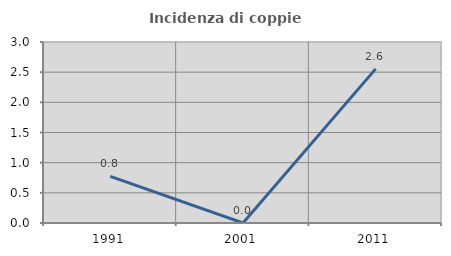
| Category | Incidenza di coppie miste |
|---|---|
| 1991.0 | 0.772 |
| 2001.0 | 0 |
| 2011.0 | 2.555 |